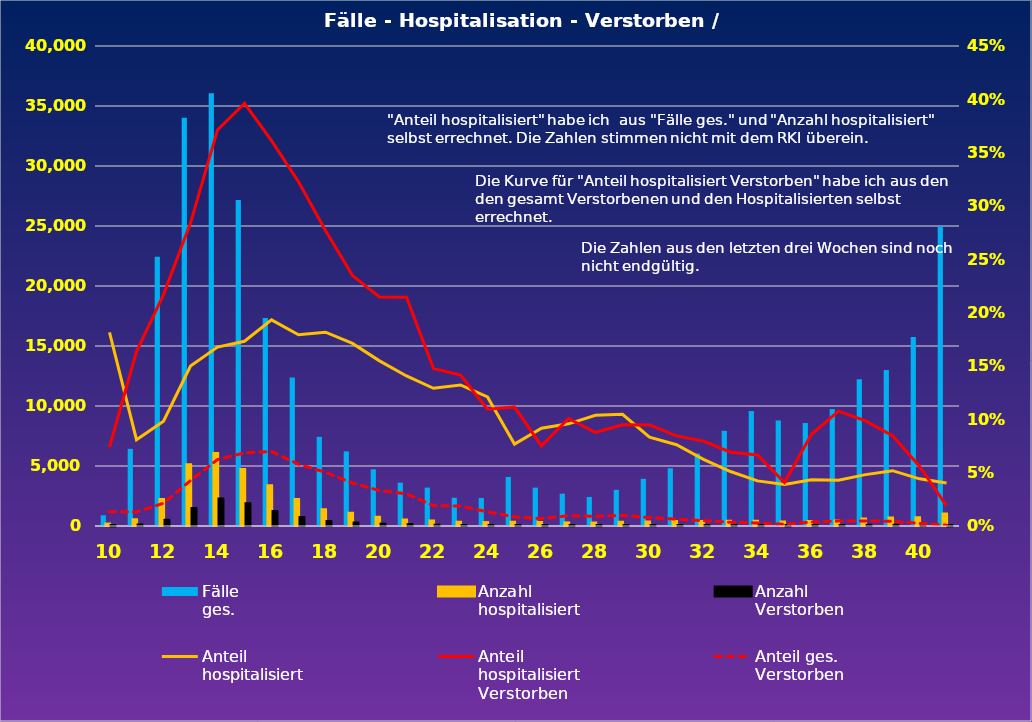
| Category | Fälle
ges. | Anzahl
hospitalisiert | Anzahl
Verstorben |
|---|---|---|---|
| 10.0 | 892 | 162 | 12 |
| 11.0 | 6430 | 520 | 85 |
| 12.0 | 22431 | 2203 | 478 |
| 13.0 | 34018 | 5102 | 1449 |
| 14.0 | 36068 | 6049 | 2246 |
| 15.0 | 27164 | 4705 | 1864 |
| 16.0 | 17334 | 3350 | 1210 |
| 17.0 | 12367 | 2218 | 716 |
| 18.0 | 7429 | 1350 | 374 |
| 19.0 | 6221 | 1065 | 250 |
| 20.0 | 4722 | 731 | 157 |
| 21.0 | 3612 | 508 | 109 |
| 22.0 | 3198 | 413 | 61 |
| 23.0 | 2352 | 311 | 44 |
| 24.0 | 2339 | 283 | 31 |
| 25.0 | 4088 | 314 | 35 |
| 26.0 | 3197 | 293 | 22 |
| 27.0 | 2693 | 258 | 26 |
| 28.0 | 2417 | 251 | 22 |
| 29.0 | 3016 | 316 | 30 |
| 30.0 | 3930 | 327 | 31 |
| 31.0 | 4814 | 367 | 31 |
| 32.0 | 6035 | 377 | 30 |
| 33.0 | 7929 | 405 | 28 |
| 34.0 | 9578 | 405 | 27 |
| 35.0 | 8796 | 343 | 14 |
| 36.0 | 8585 | 372 | 32 |
| 37.0 | 9741 | 418 | 45 |
| 38.0 | 12229 | 589 | 58 |
| 39.0 | 12995 | 674 | 57 |
| 40.0 | 15745 | 696 | 39 |
| 41.0 | 24983 | 1005 | 19 |